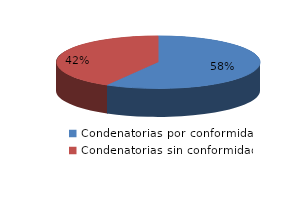
| Category | Series 0 |
|---|---|
| 0 | 7 |
| 1 | 5 |